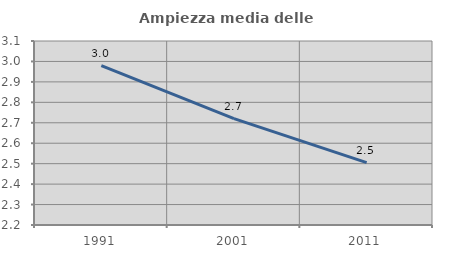
| Category | Ampiezza media delle famiglie |
|---|---|
| 1991.0 | 2.98 |
| 2001.0 | 2.721 |
| 2011.0 | 2.505 |